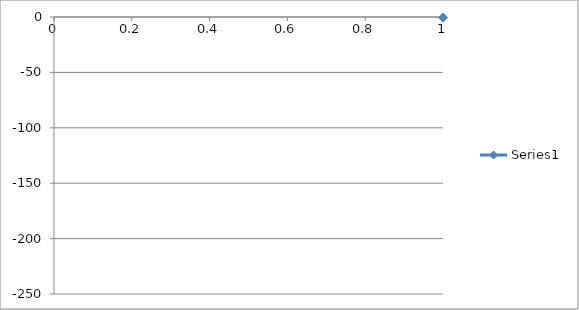
| Category | Series 0 |
|---|---|
| 0 | -0.573 |
| 1 | -0.629 |
| 2 | -0.692 |
| 3 | -0.741 |
| 4 | -0.779 |
| 5 | -0.805 |
| 6 | -0.878 |
| 7 | -0.943 |
| 8 | -0.995 |
| 9 | -1.066 |
| 10 | -1.127 |
| 11 | -1.219 |
| 12 | -1.308 |
| 13 | -1.425 |
| 14 | -1.545 |
| 15 | -1.682 |
| 16 | -1.843 |
| 17 | -2.034 |
| 18 | -2.259 |
| 19 | -2.525 |
| 20 | -2.819 |
| 21 | -3.151 |
| 22 | -3.559 |
| 23 | -4.029 |
| 24 | -4.602 |
| 25 | -5.281 |
| 26 | -6.111 |
| 27 | -7.61 |
| 28 | -9.089 |
| 29 | -10.91 |
| 30 | -13.619 |
| 31 | -14.837 |
| 32 | -16.167 |
| 33 | -17.592 |
| 34 | -19.007 |
| 35 | -20.709 |
| 36 | -22.731 |
| 37 | -25.206 |
| 38 | -27.811 |
| 39 | -30.711 |
| 40 | -33.547 |
| 41 | -37.242 |
| 42 | -41.249 |
| 43 | -45.81 |
| 44 | -50.646 |
| 45 | -55.727 |
| 46 | -61.618 |
| 47 | -68.073 |
| 48 | -75.259 |
| 49 | -82.643 |
| 50 | -90.291 |
| 51 | -98.511 |
| 52 | -107.455 |
| 53 | -116.232 |
| 54 | -125.714 |
| 55 | -134.7 |
| 56 | -144.231 |
| 57 | -153.216 |
| 58 | -161.842 |
| 59 | -170.073 |
| 60 | -178.26 |
| 61 | -186.066 |
| 62 | -192.369 |
| 63 | -199.217 |
| 64 | -204.642 |
| 65 | -209.889 |
| 66 | -214.166 |
| 67 | -218.058 |
| 68 | -221.225 |
| 69 | -224.161 |
| 70 | -226.539 |
| 71 | -228.053 |
| 72 | -229.698 |
| 73 | -231.075 |
| 74 | -231.559 |
| 75 | -232.273 |
| 76 | -232.736 |
| 77 | -233.125 |
| 78 | -233.458 |
| 79 | -233.635 |
| 80 | -233.774 |
| 81 | -233.842 |
| 82 | -233.86 |
| 83 | -233.822 |
| 84 | -233.7 |
| 85 | -233.443 |
| 86 | -232.953 |
| 87 | -232.35 |
| 88 | -230.956 |
| 89 | -229.479 |
| 90 | -227.725 |
| 91 | -225.746 |
| 92 | -222.767 |
| 93 | -219.509 |
| 94 | -215.506 |
| 95 | -210.527 |
| 96 | -205.434 |
| 97 | -199.771 |
| 98 | -193.388 |
| 99 | -186.753 |
| 100 | -178.641 |
| 101 | -170.713 |
| 102 | -162.589 |
| 103 | -153.536 |
| 104 | -144.133 |
| 105 | -134.88 |
| 106 | -125.689 |
| 107 | -116.397 |
| 108 | -107.505 |
| 109 | -99.066 |
| 110 | -90.448 |
| 111 | -82.452 |
| 112 | -75.209 |
| 113 | -68.141 |
| 114 | -61.992 |
| 115 | -56.125 |
| 116 | -50.467 |
| 117 | -45.942 |
| 118 | -41.328 |
| 119 | -37.48 |
| 120 | -33.749 |
| 121 | -30.871 |
| 122 | -28.016 |
| 123 | -25.353 |
| 124 | -22.958 |
| 125 | -21.221 |
| 126 | -19.535 |
| 127 | -17.928 |
| 128 | -16.298 |
| 129 | -14.929 |
| 130 | -13.68 |
| 131 | -11.201 |
| 132 | -9.521 |
| 133 | -7.949 |
| 134 | -6.615 |
| 135 | -6.022 |
| 136 | -5.267 |
| 137 | -4.569 |
| 138 | -3.966 |
| 139 | -3.498 |
| 140 | -3.073 |
| 141 | -2.725 |
| 142 | -2.404 |
| 143 | -2.142 |
| 144 | -1.9 |
| 145 | -1.707 |
| 146 | -1.536 |
| 147 | -1.368 |
| 148 | -1.249 |
| 149 | -1.132 |
| 150 | -1.027 |
| 151 | -0.928 |
| 152 | -0.845 |
| 153 | -0.775 |
| 154 | -0.704 |
| 155 | -0.623 |
| 156 | -0.569 |
| 157 | -0.524 |
| 158 | -0.465 |
| 159 | -0.445 |
| 160 | -0.395 |